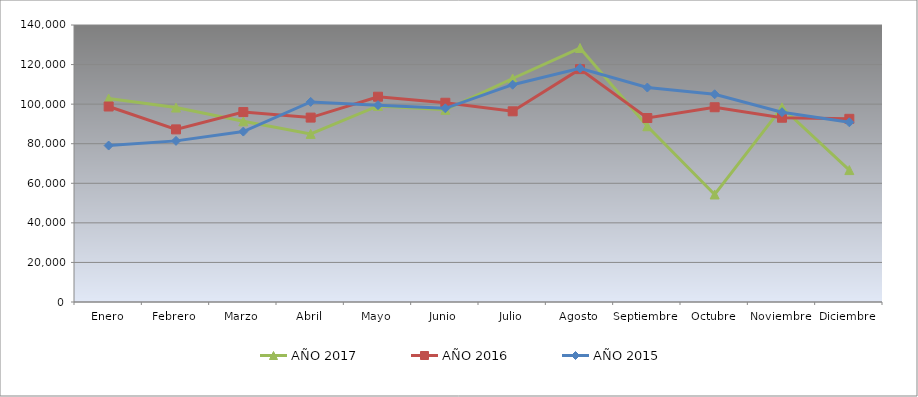
| Category | AÑO 2017 | AÑO 2016 | AÑO 2015 |
|---|---|---|---|
| Enero | 102820.593 | 98804.944 | 79074.796 |
| Febrero | 98283.884 | 87242.301 | 81434.404 |
| Marzo | 91315.258 | 96002.784 | 86127.831 |
| Abril | 84970.752 | 93200.623 | 101132.186 |
| Mayo | 99106.001 | 103752.442 | 99481.75 |
| Junio | 97138.946 | 100698.642 | 97900.082 |
| Julio | 112961.472 | 96373.846 | 109831.359 |
| Agosto | 128370.787 | 117690.738 | 118152.307 |
| Septiembre | 88835.994 | 92987.369 | 108387.227 |
| Octubre | 54341.51 | 98429.617 | 104991.799 |
| Noviembre | 98378.578 | 93132.382 | 95922.997 |
| Diciembre | 66681.875 | 92577.921 | 90825.557 |